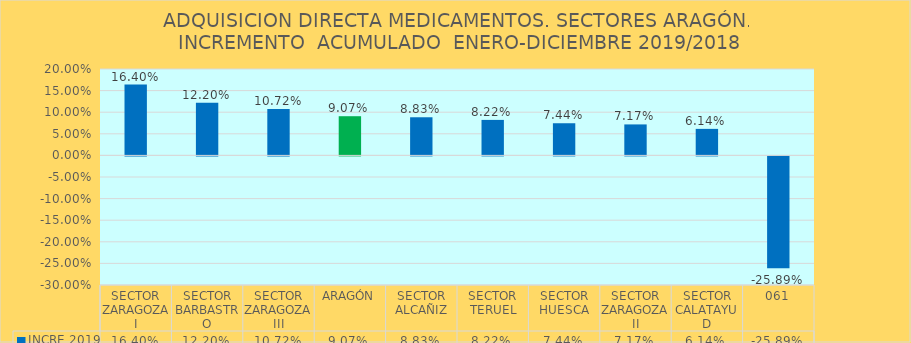
| Category | INCRE 2019 |
|---|---|
| SECTOR ZARAGOZA I | 0.164 |
| SECTOR BARBASTRO | 0.122 |
| SECTOR ZARAGOZA III | 0.107 |
| ARAGÓN | 0.091 |
| SECTOR ALCAÑIZ | 0.088 |
| SECTOR TERUEL | 0.082 |
| SECTOR HUESCA | 0.074 |
| SECTOR ZARAGOZA II | 0.072 |
| SECTOR CALATAYUD | 0.061 |
| 061 | -0.259 |